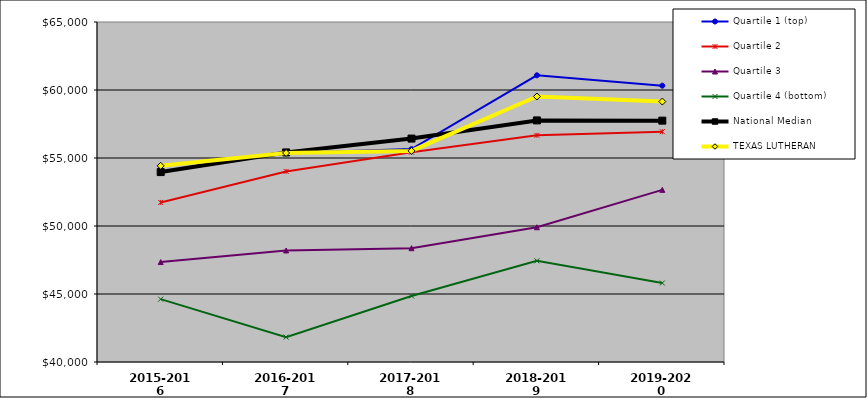
| Category | Quartile 1 (top) | Quartile 2 | Quartile 3 | Quartile 4 (bottom) | National Median | TEXAS LUTHERAN |
|---|---|---|---|---|---|---|
| 2015-2016 | 54423 | 51732 | 47349 | 44622 | 53964 | 54423 |
| 2016-2017 | 55368 | 54014 | 48200 | 41832 | 55410 | 55368 |
| 2017-2018 | 55653 | 55423 | 48369 | 44857 | 56428 | 55522 |
| 2018-2019 | 61082 | 56667 | 49907 | 47438 | 57764 | 59522 |
| 2019-2020 | 60319 | 56933 | 52657 | 45808 | 57747 | 59150 |